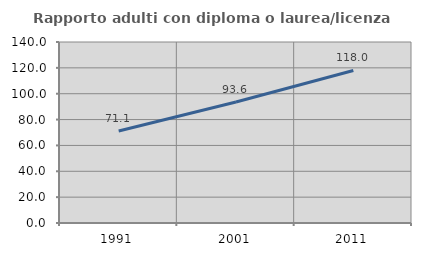
| Category | Rapporto adulti con diploma o laurea/licenza media  |
|---|---|
| 1991.0 | 71.106 |
| 2001.0 | 93.585 |
| 2011.0 | 117.989 |